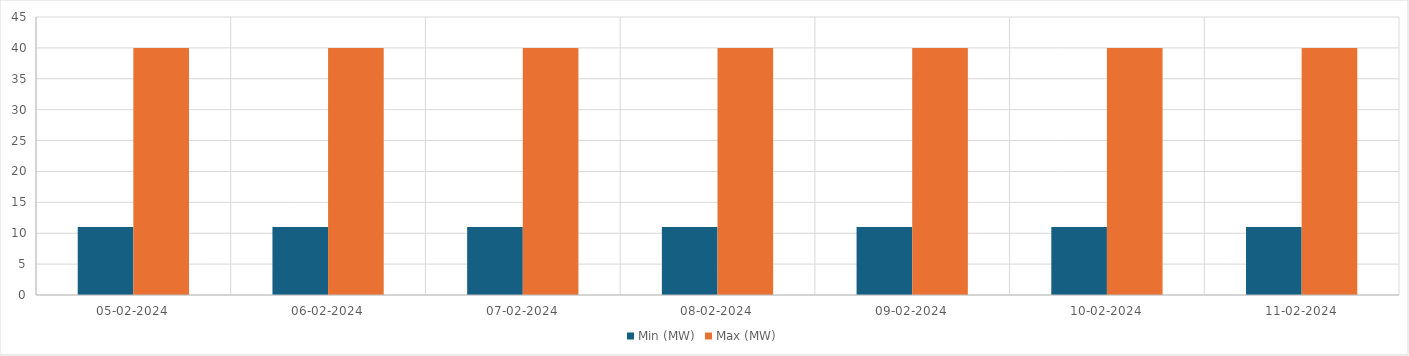
| Category | Min (MW) | Max (MW) |
|---|---|---|
| 05-02-2024 | 11 | 40 |
| 06-02-2024 | 11 | 40 |
| 07-02-2024 | 11 | 40 |
| 08-02-2024 | 11 | 40 |
| 09-02-2024 | 11 | 40 |
| 10-02-2024 | 11 | 40 |
| 11-02-2024 | 11 | 40 |